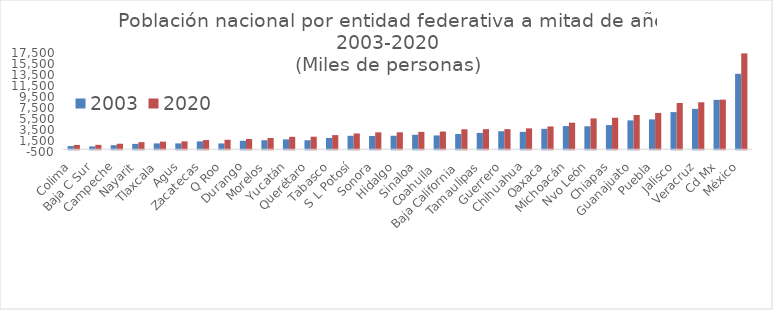
| Category | 2003 | 2020 |
|---|---|---|
| Colima | 575.411 | 785.153 |
| Baja C Sur | 511.831 | 804.708 |
| Campeche | 741.113 | 1000.617 |
| Nayarit | 970.986 | 1288.571 |
| Tlaxcala | 1063.593 | 1380.011 |
| Agus | 1062.25 | 1434.635 |
| Zacatecas | 1431.569 | 1666.426 |
| Q Roo | 1054.642 | 1723.259 |
| Durango | 1540.255 | 1868.996 |
| Morelos | 1648.428 | 2044.058 |
| Yucatán | 1797.323 | 2259.098 |
| Querétaro | 1636.56 | 2279.637 |
| Tabasco | 2062.7 | 2572.287 |
| S L Potosí | 2445.009 | 2866.142 |
| Sonora | 2416.527 | 3074.745 |
| Hidalgo | 2456.38 | 3086.414 |
| Sinaloa | 2633.143 | 3156.674 |
| Coahuila  | 2512.261 | 3218.72 |
| Baja California | 2775.926 | 3634.868 |
| Tamaulipas | 2968.581 | 3650.602 |
| Guerrero | 3276.596 | 3657.048 |
| Chihuahua | 3165.454 | 3801.487 |
| Oaxaca | 3715.944 | 4143.593 |
| Michoacán | 4212.077 | 4825.401 |
| Nvo León | 4180.268 | 5610.153 |
| Chiapas | 4397.267 | 5730.367 |
| Guanajuato | 5247.781 | 6228.175 |
| Puebla | 5428.158 | 6604.451 |
| Jalisco | 6752.883 | 8409.693 |
| Veracruz | 7333.249 | 8539.862 |
| Cd Mx | 8982.214 | 9018.645 |
| México | 13723.512 | 17427.79 |